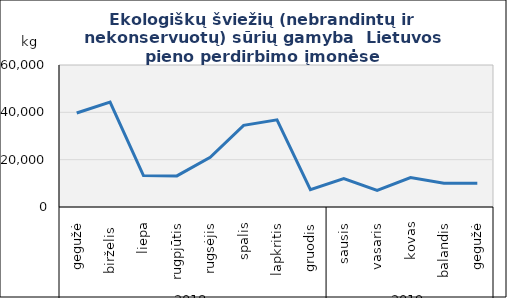
| Category | Švieži (nebrandinti ir nekonservuoti) sūriai |
|---|---|
| 0 | 39727 |
| 1 | 44362 |
| 2 | 13297 |
| 3 | 13150 |
| 4 | 21036 |
| 5 | 34481 |
| 6 | 36817 |
| 7 | 7284 |
| 8 | 12051 |
| 9 | 6984 |
| 10 | 12463 |
| 11 | 10012 |
| 12 | 10087 |